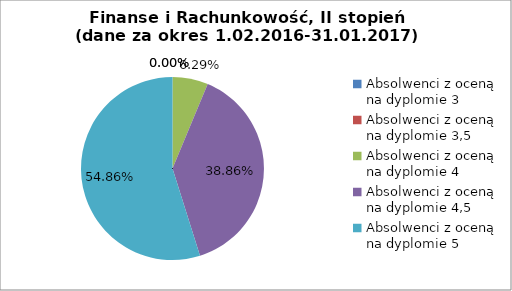
| Category | Series 0 |
|---|---|
| Absolwenci z oceną na dyplomie 3 | 0 |
| Absolwenci z oceną na dyplomie 3,5 | 0 |
| Absolwenci z oceną na dyplomie 4 | 6.286 |
| Absolwenci z oceną na dyplomie 4,5 | 38.857 |
| Absolwenci z oceną na dyplomie 5 | 54.857 |